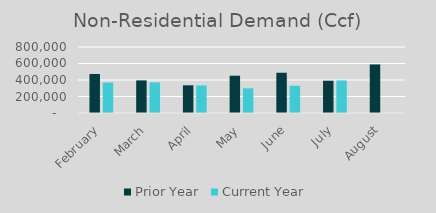
| Category | Prior Year | Current Year |
|---|---|---|
| February | 472459.203 | 369131.684 |
| March | 394966.802 | 370961.851 |
| April | 335781.44 | 333800.488 |
| May | 452130.67 | 299245.56 |
| June | 488107.52 | 330441.187 |
| July | 390975.65 | 394304.316 |
| August | 588468.22 | 0 |